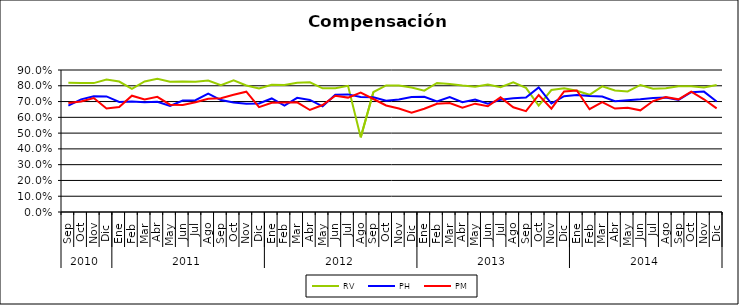
| Category | RV | PH | PM |
|---|---|---|---|
| 0 | 0.819 | 0.675 | 0.691 |
| 1 | 0.818 | 0.714 | 0.701 |
| 2 | 0.817 | 0.734 | 0.722 |
| 3 | 0.84 | 0.732 | 0.656 |
| 4 | 0.827 | 0.697 | 0.666 |
| 5 | 0.78 | 0.701 | 0.737 |
| 6 | 0.827 | 0.695 | 0.713 |
| 7 | 0.844 | 0.699 | 0.73 |
| 8 | 0.826 | 0.672 | 0.68 |
| 9 | 0.827 | 0.706 | 0.678 |
| 10 | 0.826 | 0.709 | 0.696 |
| 11 | 0.834 | 0.751 | 0.717 |
| 12 | 0.804 | 0.709 | 0.721 |
| 13 | 0.834 | 0.694 | 0.743 |
| 14 | 0.802 | 0.687 | 0.763 |
| 15 | 0.783 | 0.687 | 0.665 |
| 16 | 0.807 | 0.72 | 0.692 |
| 17 | 0.805 | 0.674 | 0.693 |
| 18 | 0.82 | 0.724 | 0.695 |
| 19 | 0.822 | 0.71 | 0.646 |
| 20 | 0.784 | 0.67 | 0.678 |
| 21 | 0.785 | 0.743 | 0.736 |
| 22 | 0.8 | 0.745 | 0.725 |
| 23 | 0.473 | 0.729 | 0.756 |
| 24 | 0.76 | 0.727 | 0.716 |
| 25 | 0.802 | 0.705 | 0.675 |
| 26 | 0.801 | 0.713 | 0.656 |
| 27 | 0.788 | 0.729 | 0.629 |
| 28 | 0.769 | 0.73 | 0.654 |
| 29 | 0.818 | 0.701 | 0.686 |
| 30 | 0.811 | 0.728 | 0.691 |
| 31 | 0.801 | 0.696 | 0.661 |
| 32 | 0.793 | 0.712 | 0.687 |
| 33 | 0.808 | 0.687 | 0.67 |
| 34 | 0.791 | 0.712 | 0.727 |
| 35 | 0.822 | 0.721 | 0.664 |
| 36 | 0.787 | 0.725 | 0.64 |
| 37 | 0.674 | 0.79 | 0.742 |
| 38 | 0.773 | 0.687 | 0.655 |
| 39 | 0.784 | 0.734 | 0.764 |
| 40 | 0.769 | 0.742 | 0.77 |
| 41 | 0.743 | 0.736 | 0.652 |
| 42 | 0.796 | 0.732 | 0.697 |
| 43 | 0.771 | 0.702 | 0.655 |
| 44 | 0.764 | 0.708 | 0.66 |
| 45 | 0.805 | 0.714 | 0.644 |
| 46 | 0.782 | 0.723 | 0.703 |
| 47 | 0.785 | 0.726 | 0.728 |
| 48 | 0.797 | 0.711 | 0.714 |
| 49 | 0.797 | 0.759 | 0.763 |
| 50 | 0.789 | 0.763 | 0.714 |
| 51 | 0.805 | 0.701 | 0.657 |